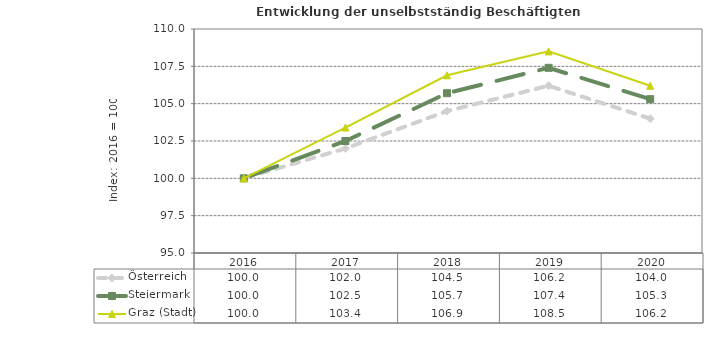
| Category | Österreich | Steiermark | Graz (Stadt) |
|---|---|---|---|
| 2020.0 | 104 | 105.3 | 106.2 |
| 2019.0 | 106.2 | 107.4 | 108.5 |
| 2018.0 | 104.5 | 105.7 | 106.9 |
| 2017.0 | 102 | 102.5 | 103.4 |
| 2016.0 | 100 | 100 | 100 |